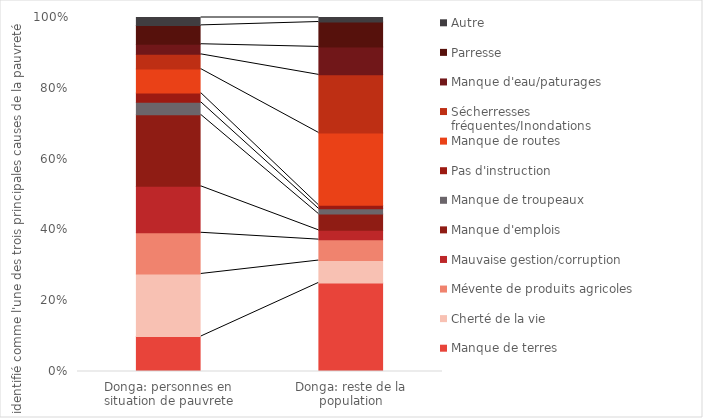
| Category | Manque de terres | Cherté de la vie | Mévente de produits agricoles | Mauvaise gestion/corruption | Manque d'emplois | Manque de troupeaux | Pas d'instruction | Manque de routes | Sécherresses fréquentes/Inondations | Manque d'eau/paturages | Parresse | Autre |
|---|---|---|---|---|---|---|---|---|---|---|---|---|
| Donga: personnes en situation de pauvrete | 0.263 | 0.471 | 0.31 | 0.35 | 0.538 | 0.095 | 0.069 | 0.18 | 0.111 | 0.076 | 0.142 | 0.059 |
| Donga: reste de la population | 0.723 | 0.182 | 0.171 | 0.076 | 0.133 | 0.043 | 0.029 | 0.59 | 0.473 | 0.228 | 0.203 | 0.037 |